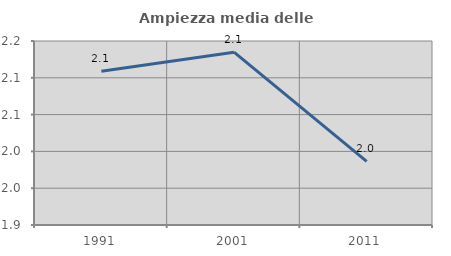
| Category | Ampiezza media delle famiglie |
|---|---|
| 1991.0 | 2.109 |
| 2001.0 | 2.135 |
| 2011.0 | 1.986 |